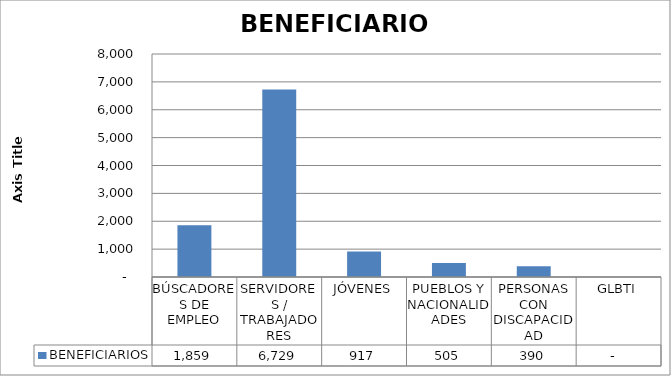
| Category | BENEFICIARIOS |
|---|---|
| BÚSCADORES DE EMPLEO | 1859 |
| SERVIDORES / TRABAJADORES | 6729 |
| JÓVENES | 917 |
| PUEBLOS Y NACIONALIDADES | 505 |
| PERSONAS CON DISCAPACIDAD | 390 |
| GLBTI | 0 |